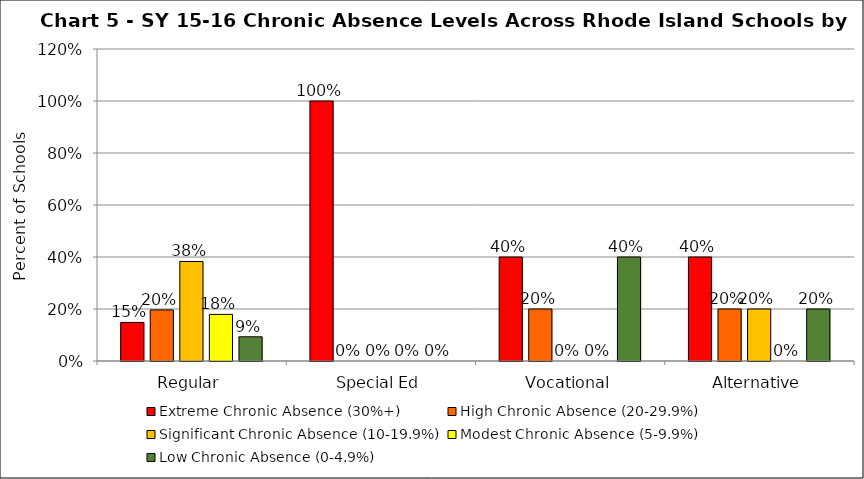
| Category | Extreme Chronic Absence (30%+) | High Chronic Absence (20-29.9%) | Significant Chronic Absence (10-19.9%) | Modest Chronic Absence (5-9.9%) | Low Chronic Absence (0-4.9%) |
|---|---|---|---|---|---|
| 0 | 0.148 | 0.197 | 0.383 | 0.179 | 0.093 |
| 1 | 1 | 0 | 0 | 0 | 0 |
| 2 | 0.4 | 0.2 | 0 | 0 | 0.4 |
| 3 | 0.4 | 0.2 | 0.2 | 0 | 0.2 |